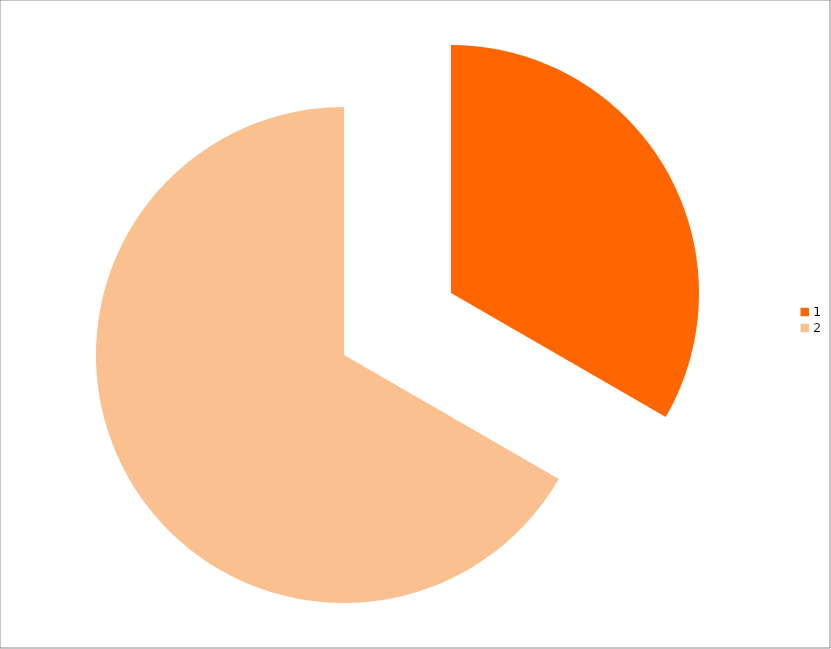
| Category | Series 0 |
|---|---|
| 0 | 13 |
| 1 | 26 |